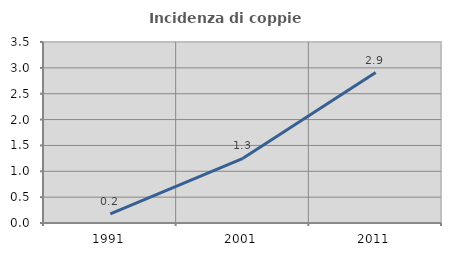
| Category | Incidenza di coppie miste |
|---|---|
| 1991.0 | 0.176 |
| 2001.0 | 1.251 |
| 2011.0 | 2.908 |